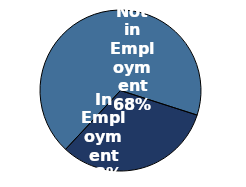
| Category | Series 0 |
|---|---|
| Not in Employment | 0.68 |
| In Employment | 0.32 |